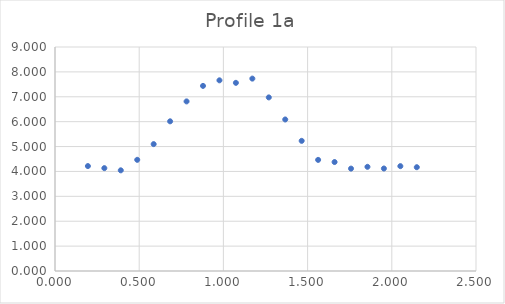
| Category | Series 0 |
|---|---|
| 0.1953125 | 4.216 |
| 0.29296875 | 4.133 |
| 0.390625 | 4.045 |
| 0.48828125 | 4.467 |
| 0.5859375 | 5.098 |
| 0.68359375 | 6.014 |
| 0.78125 | 6.814 |
| 0.87890625 | 7.437 |
| 0.9765625 | 7.661 |
| 1.07421875 | 7.56 |
| 1.171875 | 7.73 |
| 1.26953125 | 6.975 |
| 1.3671875 | 6.088 |
| 1.46484375 | 5.229 |
| 1.5625 | 4.464 |
| 1.66015625 | 4.378 |
| 1.7578125 | 4.114 |
| 1.85546875 | 4.186 |
| 1.953125 | 4.118 |
| 2.05078125 | 4.213 |
| 2.1484375 | 4.17 |